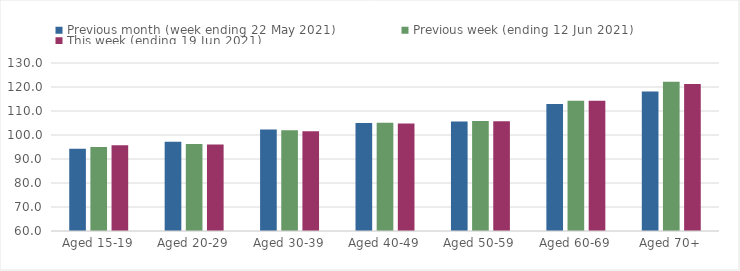
| Category | Previous month (week ending 22 May 2021) | Previous week (ending 12 Jun 2021) | This week (ending 19 Jun 2021) |
|---|---|---|---|
| Aged 15-19 | 94.32 | 94.97 | 95.72 |
| Aged 20-29 | 97.15 | 96.22 | 96.02 |
| Aged 30-39 | 102.31 | 101.97 | 101.59 |
| Aged 40-49 | 104.96 | 105.11 | 104.79 |
| Aged 50-59 | 105.67 | 105.83 | 105.71 |
| Aged 60-69 | 112.92 | 114.31 | 114.22 |
| Aged 70+ | 118.17 | 122.23 | 121.28 |